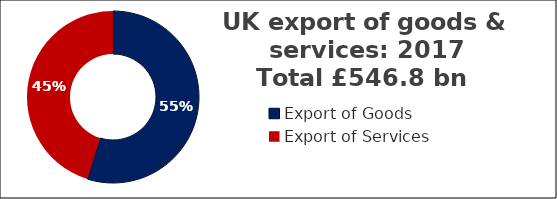
| Category |  £ billion  |
|---|---|
| Export of Goods | 338.739 |
| Export of Services | 279.024 |